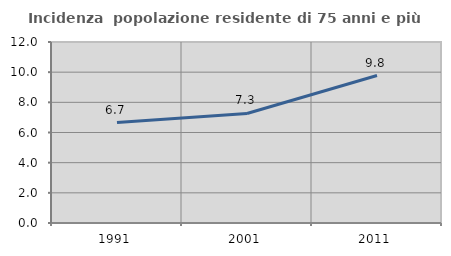
| Category | Incidenza  popolazione residente di 75 anni e più |
|---|---|
| 1991.0 | 6.66 |
| 2001.0 | 7.263 |
| 2011.0 | 9.775 |